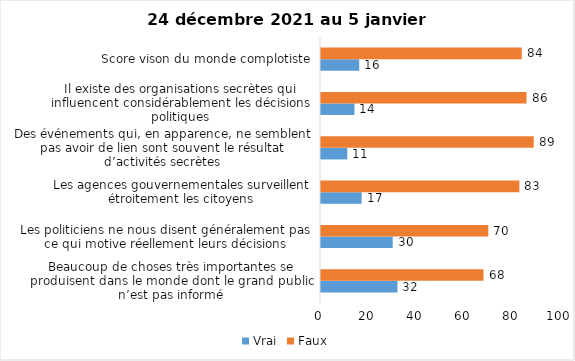
| Category | Vrai | Faux |
|---|---|---|
| Beaucoup de choses très importantes se produisent dans le monde dont le grand public n’est pas informé | 32 | 68 |
| Les politiciens ne nous disent généralement pas ce qui motive réellement leurs décisions | 30 | 70 |
| Les agences gouvernementales surveillent étroitement les citoyens | 17 | 83 |
| Des événements qui, en apparence, ne semblent pas avoir de lien sont souvent le résultat d’activités secrètes | 11 | 89 |
| Il existe des organisations secrètes qui influencent considérablement les décisions politiques | 14 | 86 |
| Score vison du monde complotiste | 16 | 84 |